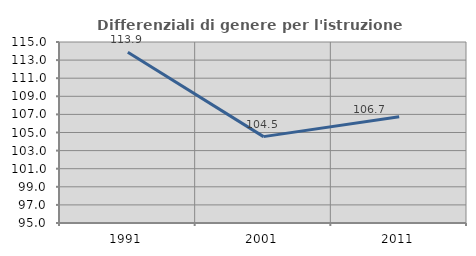
| Category | Differenziali di genere per l'istruzione superiore |
|---|---|
| 1991.0 | 113.869 |
| 2001.0 | 104.544 |
| 2011.0 | 106.744 |